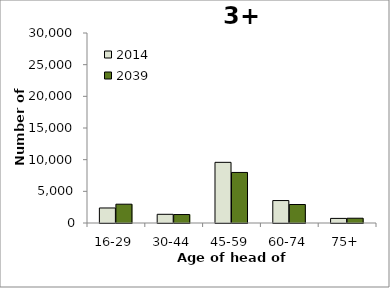
| Category | 2014 | 2039 |
|---|---|---|
| 16-29 | 2373 | 2968 |
| 30-44 | 1374 | 1336 |
| 45-59 | 9579 | 7983 |
| 60-74 | 3544 | 2921 |
| 75+ | 727 | 753 |